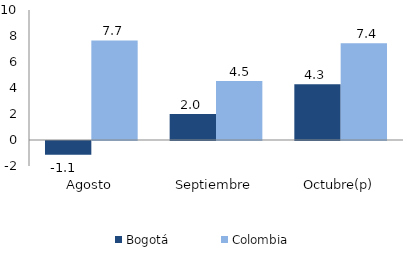
| Category | Bogotá | Colombia |
|---|---|---|
| Agosto | -1.065 | 7.663 |
| Septiembre | 2 | 4.534 |
| Octubre(p) | 4.282 | 7.446 |